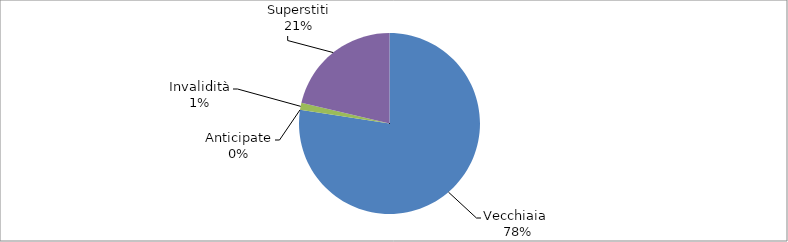
| Category | Series 0 |
|---|---|
| Vecchiaia  | 30316 |
| Anticipate | 0 |
| Invalidità | 491 |
| Superstiti | 8356 |